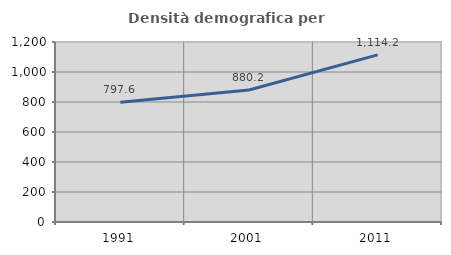
| Category | Densità demografica |
|---|---|
| 1991.0 | 797.577 |
| 2001.0 | 880.167 |
| 2011.0 | 1114.21 |